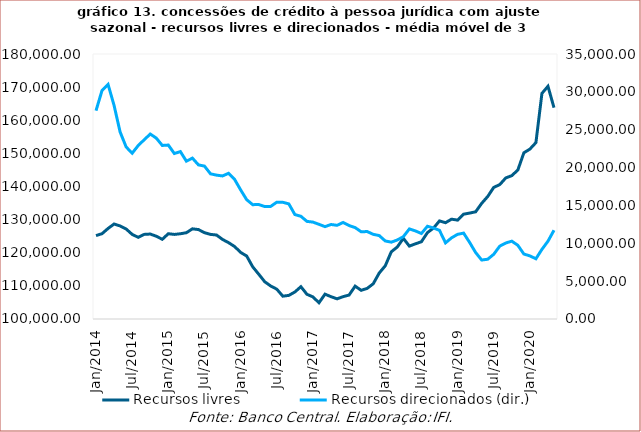
| Category | Recursos livres |
|---|---|
| 2014-01-01 | 125177.667 |
| 2014-02-01 | 125757.667 |
| 2014-03-01 | 127337.667 |
| 2014-04-01 | 128674.667 |
| 2014-05-01 | 128093.333 |
| 2014-06-01 | 127165.667 |
| 2014-07-01 | 125545.667 |
| 2014-08-01 | 124657 |
| 2014-09-01 | 125543.333 |
| 2014-10-01 | 125646 |
| 2014-11-01 | 124991.667 |
| 2014-12-01 | 124057 |
| 2015-01-01 | 125746.333 |
| 2015-02-01 | 125532.667 |
| 2015-03-01 | 125735.333 |
| 2015-04-01 | 126049.333 |
| 2015-05-01 | 127227.333 |
| 2015-06-01 | 126997 |
| 2015-07-01 | 126059 |
| 2015-08-01 | 125539.667 |
| 2015-09-01 | 125351.667 |
| 2015-10-01 | 124009.667 |
| 2015-11-01 | 123044 |
| 2015-12-01 | 121875.333 |
| 2016-01-01 | 120098.667 |
| 2016-02-01 | 119021.333 |
| 2016-03-01 | 115763 |
| 2016-04-01 | 113527 |
| 2016-05-01 | 111248.667 |
| 2016-06-01 | 109952.667 |
| 2016-07-01 | 109003.333 |
| 2016-08-01 | 106889.667 |
| 2016-09-01 | 107129 |
| 2016-10-01 | 108156.333 |
| 2016-11-01 | 109755.667 |
| 2016-12-01 | 107459.667 |
| 2017-01-01 | 106668.667 |
| 2017-02-01 | 104896 |
| 2017-03-01 | 107502 |
| 2017-04-01 | 106737.667 |
| 2017-05-01 | 106087.333 |
| 2017-06-01 | 106743.667 |
| 2017-07-01 | 107232 |
| 2017-08-01 | 109924 |
| 2017-09-01 | 108661 |
| 2017-10-01 | 109238.667 |
| 2017-11-01 | 110627.667 |
| 2017-12-01 | 113883.667 |
| 2018-01-01 | 116058 |
| 2018-02-01 | 120278 |
| 2018-03-01 | 121740.667 |
| 2018-04-01 | 124345.667 |
| 2018-05-01 | 122005.667 |
| 2018-06-01 | 122694.333 |
| 2018-07-01 | 123320 |
| 2018-08-01 | 126072.667 |
| 2018-09-01 | 127437 |
| 2018-10-01 | 129610 |
| 2018-11-01 | 129071.333 |
| 2018-12-01 | 130137.333 |
| 2019-01-01 | 129855 |
| 2019-02-01 | 131642.333 |
| 2019-03-01 | 131976 |
| 2019-04-01 | 132366 |
| 2019-05-01 | 134908.667 |
| 2019-06-01 | 136986.667 |
| 2019-07-01 | 139723.667 |
| 2019-08-01 | 140572 |
| 2019-09-01 | 142587 |
| 2019-10-01 | 143280 |
| 2019-11-01 | 144976.333 |
| 2019-12-01 | 150173.333 |
| 2020-01-01 | 151288.667 |
| 2020-02-01 | 153246.333 |
| 2020-03-01 | 168110 |
| 2020-04-01 | 170258.333 |
| 2020-05-01 | 163799.333 |